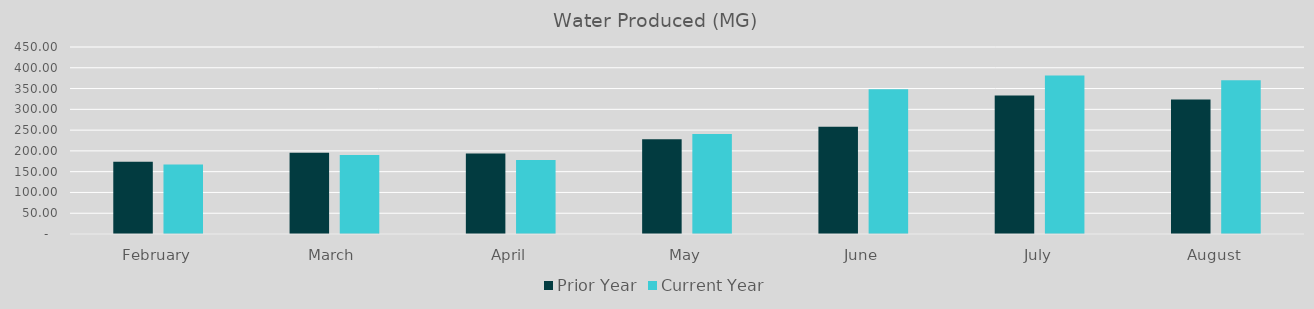
| Category | Prior Year | Current Year |
|---|---|---|
| February | 173.847 | 167.532 |
| March | 195.333 | 190.306 |
| April | 193.551 | 178.22 |
| May | 228.091 | 240.625 |
| June | 257.9 | 348.57 |
| July | 333.37 | 381.34 |
| August | 323.49 | 370.12 |